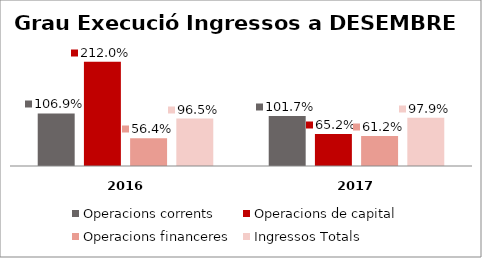
| Category | Operacions corrents | Operacions de capital | Operacions financeres | Ingressos Totals |
|---|---|---|---|---|
| 0 | 1.069 | 2.12 | 0.564 | 0.965 |
| 1 | 1.017 | 0.652 | 0.612 | 0.979 |